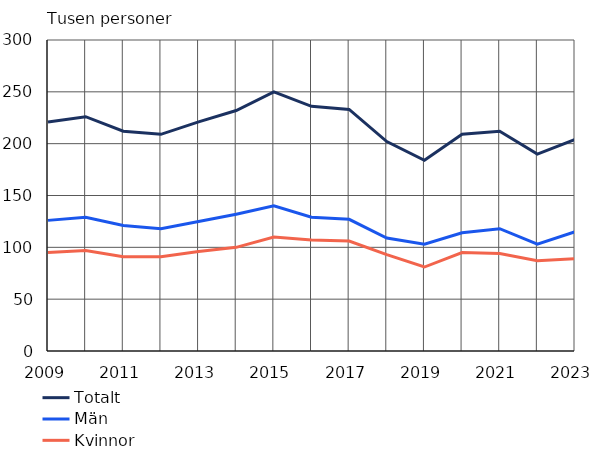
| Category | Totalt | Män | Kvinnor |
|---|---|---|---|
| 2009 | 221 | 126 | 95 |
| 2010 | 226 | 129 | 97 |
| 2011 | 212 | 121 | 91 |
| 2012 | 209 | 118 | 91 |
| 2013 | 221 | 125 | 96 |
| 2014 | 232 | 132 | 100 |
| 2015 | 250 | 140 | 110 |
| 2016 | 236 | 129 | 107 |
| 2017 | 233 | 127 | 106 |
| 2018 | 202 | 109 | 93 |
| 2019 | 184 | 103 | 81 |
| 2020 | 209 | 114 | 95 |
| 2021 | 212 | 118 | 94 |
| 2022 | 190 | 103 | 87 |
| 2023 | 204 | 115 | 89 |